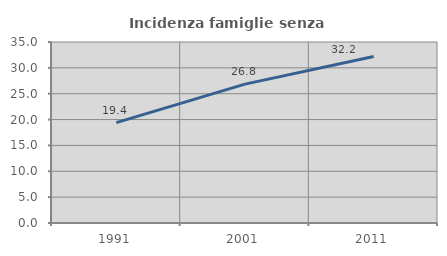
| Category | Incidenza famiglie senza nuclei |
|---|---|
| 1991.0 | 19.407 |
| 2001.0 | 26.849 |
| 2011.0 | 32.202 |